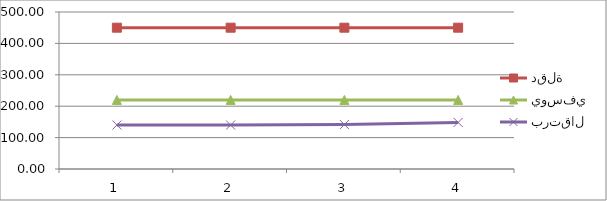
| Category | دقلة | يوسفي | برتقال |
|---|---|---|---|
| 0 | 450 | 220 | 140 |
| 1 | 450 | 220 | 140 |
| 2 | 450 | 220 | 141.67 |
| 3 | 450 | 220 | 148.33 |